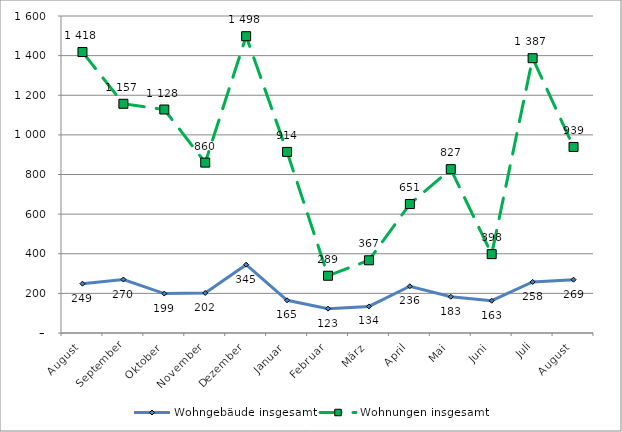
| Category | Wohngebäude insgesamt | Wohnungen insgesamt |
|---|---|---|
| August | 249 | 1418 |
| September | 270 | 1157 |
| Oktober | 199 | 1128 |
| November | 202 | 860 |
| Dezember | 345 | 1498 |
| Januar | 165 | 914 |
| Februar | 123 | 289 |
| März | 134 | 367 |
| April | 236 | 651 |
| Mai | 183 | 827 |
| Juni | 163 | 398 |
| Juli | 258 | 1387 |
| August | 269 | 939 |